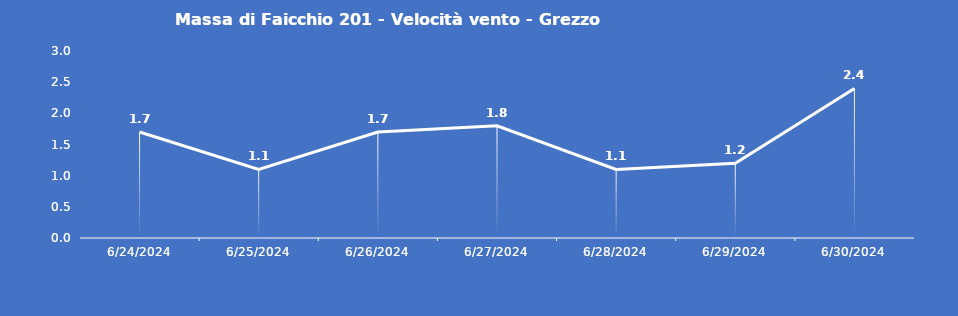
| Category | Massa di Faicchio 201 - Velocità vento - Grezzo (m/s) |
|---|---|
| 6/24/24 | 1.7 |
| 6/25/24 | 1.1 |
| 6/26/24 | 1.7 |
| 6/27/24 | 1.8 |
| 6/28/24 | 1.1 |
| 6/29/24 | 1.2 |
| 6/30/24 | 2.4 |